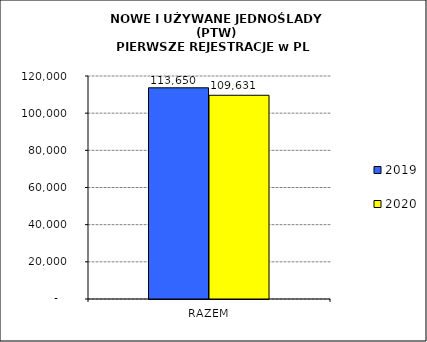
| Category | 2019 | 2020 |
|---|---|---|
| RAZEM | 113650 | 109631 |